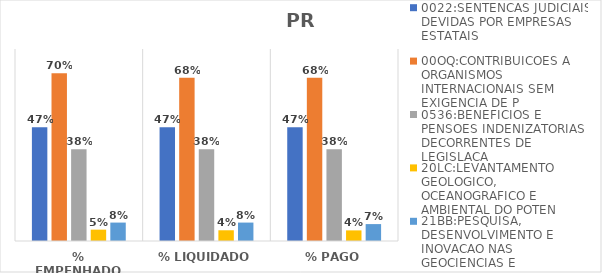
| Category | 0022:SENTENCAS JUDICIAIS DEVIDAS POR EMPRESAS ESTATAIS | 00OQ:CONTRIBUICOES A ORGANISMOS INTERNACIONAIS SEM EXIGENCIA DE P | 0536:BENEFICIOS E PENSOES INDENIZATORIAS DECORRENTES DE LEGISLACA | 20LC:LEVANTAMENTO GEOLOGICO, OCEANOGRAFICO E AMBIENTAL DO POTEN | 21BB:PESQUISA, DESENVOLVIMENTO E INOVACAO NAS GEOCIENCIAS E |
|---|---|---|---|---|---|
| % EMPENHADO | 0.474 | 0.699 | 0.383 | 0.047 | 0.077 |
| % LIQUIDADO | 0.474 | 0.681 | 0.383 | 0.045 | 0.077 |
| % PAGO | 0.474 | 0.681 | 0.383 | 0.044 | 0.07 |